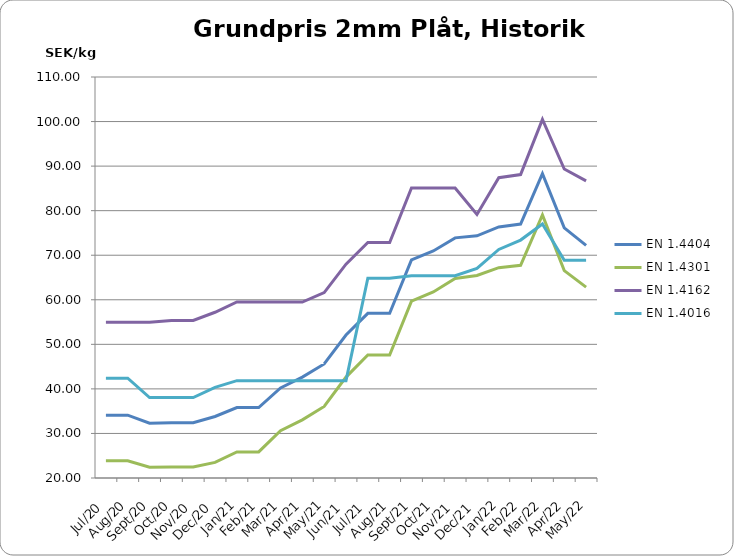
| Category | EN 1.4404 | EN 1.4301 | EN 1.4162  | EN 1.4016 |
|---|---|---|---|---|
| 2020-07-26 | 34.1 | 23.85 | 54.95 | 42.4 |
| 2020-08-26 | 34.1 | 23.85 | 54.95 | 42.4 |
| 2020-09-26 | 32.3 | 22.4 | 54.95 | 38.05 |
| 2020-10-26 | 32.4 | 22.45 | 55.35 | 38.05 |
| 2020-11-26 | 32.4 | 22.45 | 55.35 | 38.05 |
| 2020-12-26 | 33.8 | 23.5 | 57.2 | 40.35 |
| 2021-01-26 | 35.8 | 25.85 | 59.5 | 41.85 |
| 2021-02-26 | 35.8 | 25.85 | 59.5 | 41.85 |
| 2021-03-26 | 40.2 | 30.6 | 59.5 | 41.85 |
| 2021-04-26 | 42.65 | 33.05 | 59.5 | 41.85 |
| 2021-05-26 | 45.6 | 36.05 | 61.6 | 41.85 |
| 2021-06-26 | 52.1 | 42.65 | 68 | 41.85 |
| 2021-07-26 | 56.95 | 47.6 | 72.85 | 64.85 |
| 2021-08-26 | 56.95 | 47.6 | 72.85 | 64.85 |
| 2021-09-26 | 68.95 | 59.7 | 85.1 | 65.4 |
| 2021-10-26 | 70.95 | 61.75 | 85.1 | 65.4 |
| 2021-11-26 | 73.9 | 64.8 | 85.1 | 65.4 |
| 2021-12-26 | 74.35 | 65.45 | 79.15 | 67.05 |
| 2022-01-26 | 76.35 | 67.2 | 87.4 | 71.3 |
| 2022-02-26 | 77 | 67.75 | 88.1 | 73.4 |
| 2022-03-26 | 88.3 | 79.05 | 100.5 | 77 |
| 2022-04-26 | 76.15 | 66.55 | 89.35 | 68.85 |
| 2022-05-26 | 72.2 | 62.85 | 86.7 | 68.85 |